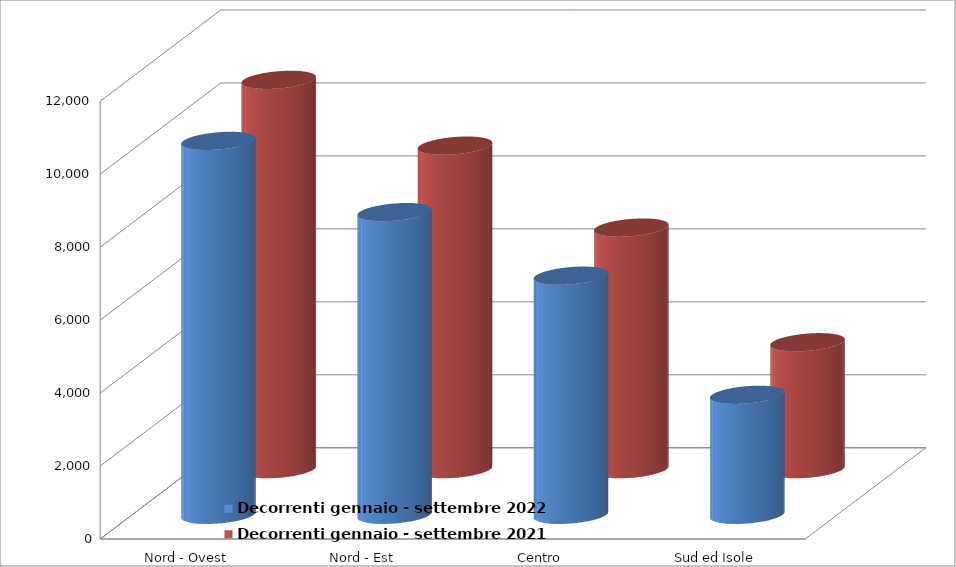
| Category | Decorrenti gennaio - settembre 2022 | Decorrenti gennaio - settembre 2021 |
|---|---|---|
| Nord - Ovest | 10250 | 10673 |
| Nord - Est | 8298 | 8870 |
| Centro | 6555 | 6624 |
| Sud ed Isole | 3290 | 3481 |